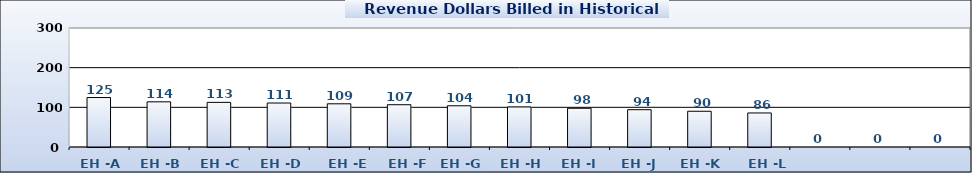
| Category | Series 0 |
|---|---|
| EH -A | 124.711 |
| EH -B | 113.85 |
| EH -C | 112.53 |
| EH -D | 110.88 |
| EH -E | 108.9 |
| EH -F | 106.59 |
| EH -G | 103.95 |
| EH -H | 100.98 |
| EH -I | 97.68 |
| EH -J | 94.05 |
| EH -K | 90.09 |
| EH -L | 85.8 |
|   | 0 |
|   | 0 |
|   | 0 |